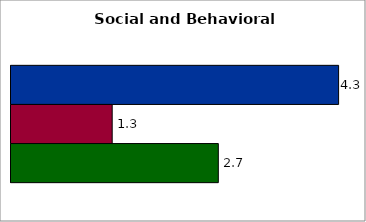
| Category | 50 states and D.C. | SREB states | State |
|---|---|---|---|
| 0 | 4.261 | 1.316 | 2.696 |